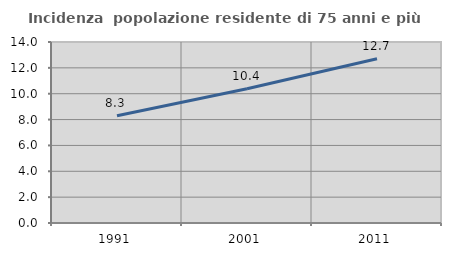
| Category | Incidenza  popolazione residente di 75 anni e più |
|---|---|
| 1991.0 | 8.296 |
| 2001.0 | 10.387 |
| 2011.0 | 12.707 |